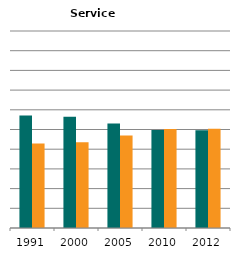
| Category | Male | Female |
|---|---|---|
| 1991.0 | 0.571 | 0.429 |
| 2000.0 | 0.564 | 0.436 |
| 2005.0 | 0.531 | 0.469 |
| 2010.0 | 0.498 | 0.502 |
| 2012.0 | 0.496 | 0.504 |